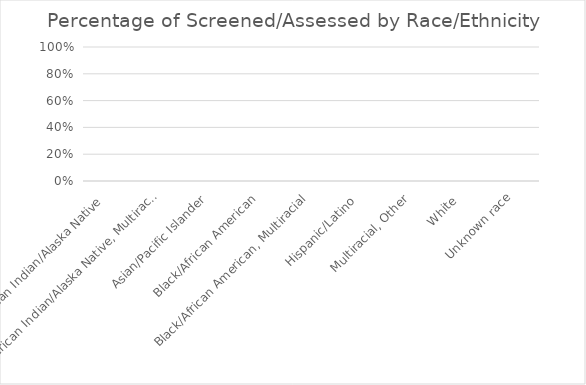
| Category | % of screened |
|---|---|
| American Indian/Alaska Native  | 0 |
| American Indian/Alaska Native, Multiracial | 0 |
| Asian/Pacific Islander | 0 |
| Black/African American | 0 |
| Black/African American, Multiracial | 0 |
| Hispanic/Latino  | 0 |
| Multiracial, Other | 0 |
| White  | 0 |
| Unknown race | 0 |